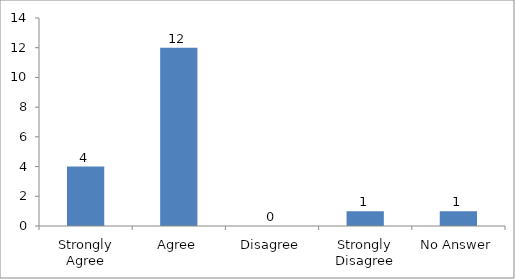
| Category | Was the social entrepreneurship program worth the resources it cost to your institution? |
|---|---|
| Strongly Agree | 4 |
| Agree | 12 |
| Disagree | 0 |
| Strongly Disagree | 1 |
| No Answer | 1 |